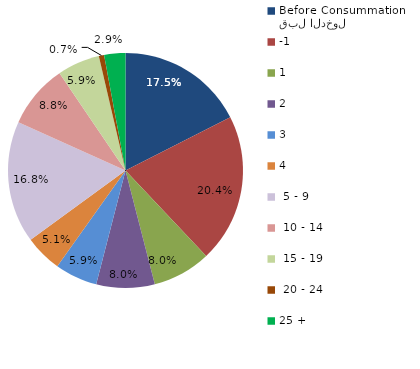
| Category | Series 0 |
|---|---|
| قبل الدخول
Before Consummation | 17.518 |
| -1 | 20.438 |
| 1 | 8.029 |
| 2 | 8.029 |
| 3 | 5.839 |
| 4 | 5.109 |
|  5 - 9 | 16.788 |
|  10 - 14 | 8.759 |
|  15 - 19 | 5.839 |
|  20 - 24 | 0.73 |
| 25 + | 2.92 |